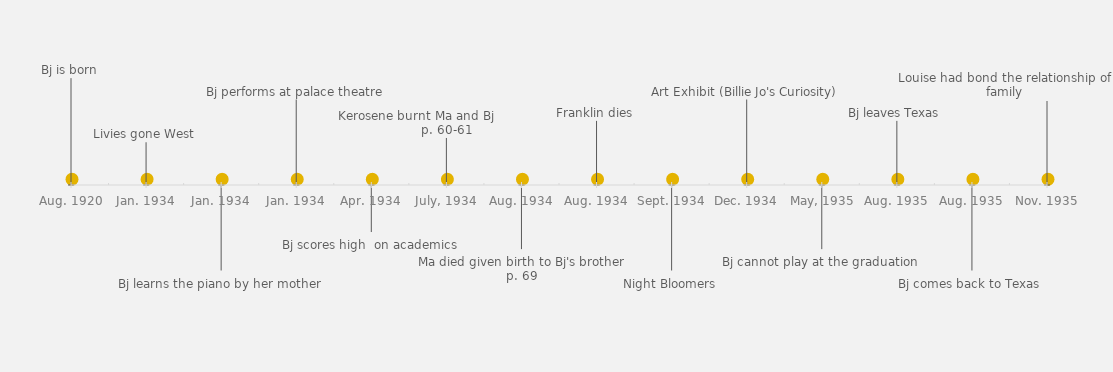
| Category | POSITION |
|---|---|
| Bj is born | 25 |
| Livies gone West | 10 |
| Bj learns the piano by her mother | -20 |
| Bj performs at palace theatre | 20 |
| Bj scores high  on academics | -11 |
| Kerosene burnt Ma and Bj                 p. 60-61 | 11 |
| Ma died given birth to Bj's brother p. 69 | -15 |
| Franklin dies | 15 |
| Night Bloomers | -20 |
| Art Exhibit (Billie Jo's Curiosity) | 20 |
| Bj cannot play at the graduation | -15 |
| Bj leaves Texas | 15 |
| Bj comes back to Texas | -20 |
| Louise had bond the relationship of family | 20 |